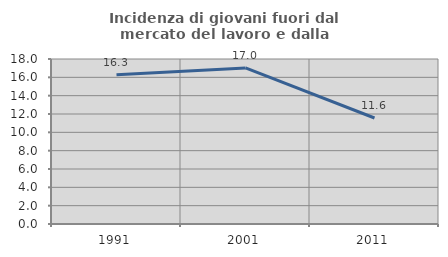
| Category | Incidenza di giovani fuori dal mercato del lavoro e dalla formazione  |
|---|---|
| 1991.0 | 16.294 |
| 2001.0 | 17.028 |
| 2011.0 | 11.565 |